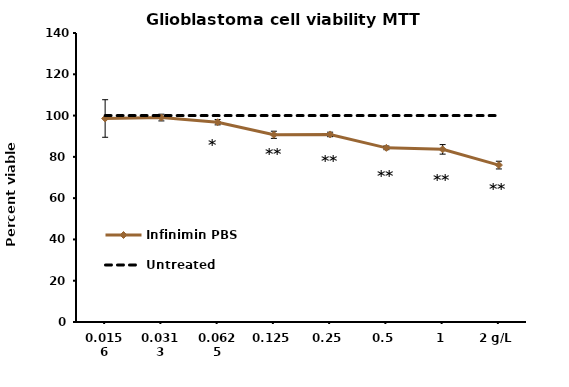
| Category | Infinimin PBS | Untreated |
|---|---|---|
| 0.0156 | 98.586 | 100 |
| 0.0313 | 99.037 | 100 |
| 0.0625 | 96.78 | 100 |
| 0.125 | 90.685 | 100 |
| 0.25 | 90.855 | 100 |
| 0.5 | 84.365 | 100 |
| 1 | 83.632 | 100 |
| 2 g/L | 76.013 | 100 |